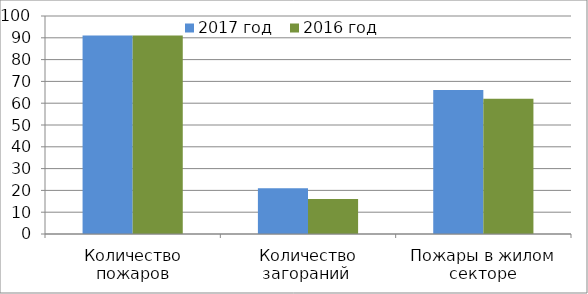
| Category | 2017 год | 2016 год |
|---|---|---|
| Количество пожаров | 91 | 91 |
| Количество загораний  | 21 | 16 |
| Пожары в жилом секторе | 66 | 62 |